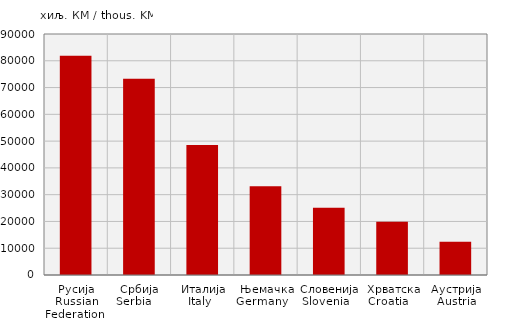
| Category | Увоз
Import |
|---|---|
| Русија
Russian Federation  | 81846 |
| Србија
Serbia    | 73306 |
| Италија
Italy   | 48594 |
| Њемачка
Germany    | 33150 |
| Словенија
Slovenia   | 25112 |
| Хрватска
Croatia    | 19932 |
| Аустрија
Austria | 12393 |